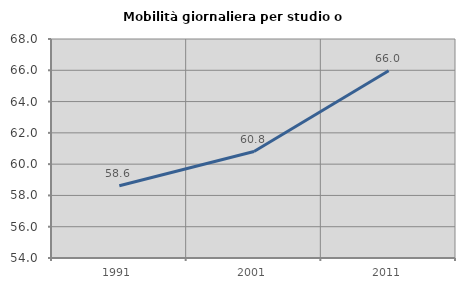
| Category | Mobilità giornaliera per studio o lavoro |
|---|---|
| 1991.0 | 58.614 |
| 2001.0 | 60.805 |
| 2011.0 | 65.967 |